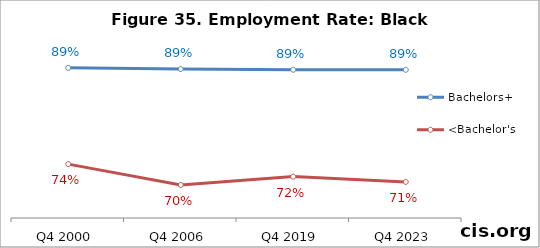
| Category | Bachelors+ | <Bachelor's |
|---|---|---|
| Q4 2000 | 0.891 | 0.736 |
| Q4 2006 | 0.889 | 0.703 |
| Q4 2019 | 0.888 | 0.716 |
| Q4 2023 | 0.888 | 0.708 |